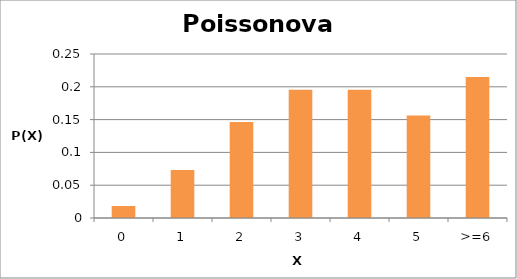
| Category | Series 0 |
|---|---|
| 0 | 0.018 |
| 1 | 0.073 |
| 2 | 0.147 |
| 3 | 0.195 |
| 4 | 0.195 |
| 5 | 0.156 |
| >=6 | 0.215 |